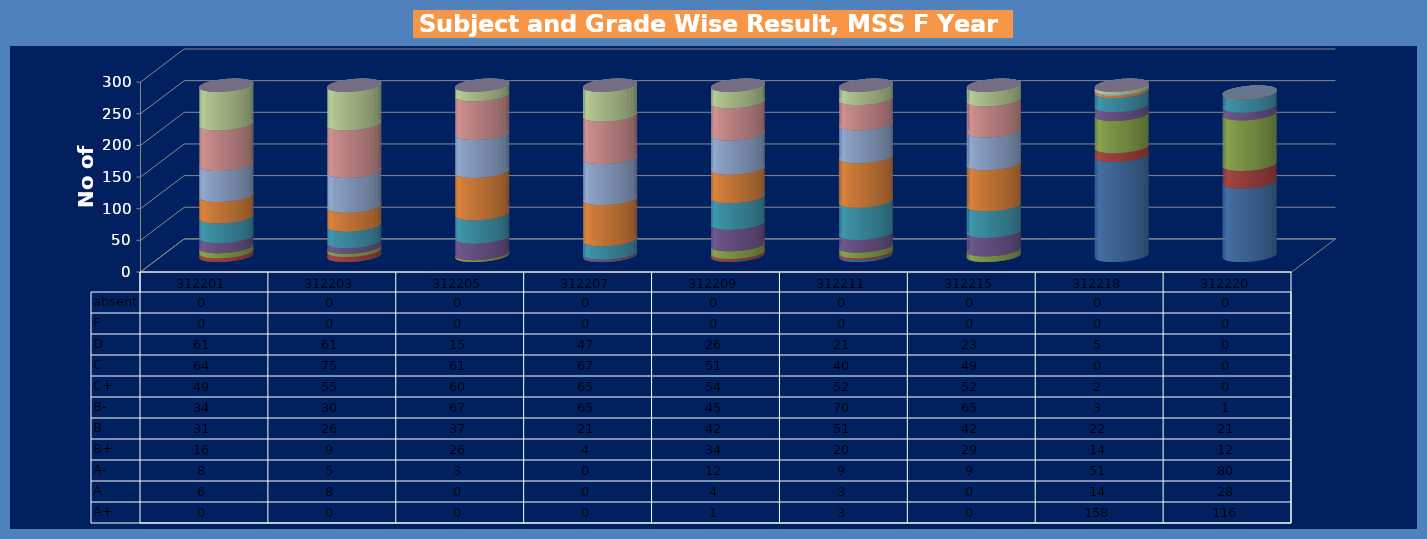
| Category | A+ | A | A- | B+ | B | B- | C+ | C | D | F | absent |
|---|---|---|---|---|---|---|---|---|---|---|---|
| 312201.0 | 0 | 6 | 8 | 16 | 31 | 34 | 49 | 64 | 61 | 0 | 0 |
| 312203.0 | 0 | 8 | 5 | 9 | 26 | 30 | 55 | 75 | 61 | 0 | 0 |
| 312205.0 | 0 | 0 | 3 | 26 | 37 | 67 | 60 | 61 | 15 | 0 | 0 |
| 312207.0 | 0 | 0 | 0 | 4 | 21 | 65 | 65 | 67 | 47 | 0 | 0 |
| 312209.0 | 1 | 4 | 12 | 34 | 42 | 45 | 54 | 51 | 26 | 0 | 0 |
| 312211.0 | 3 | 3 | 9 | 20 | 51 | 70 | 52 | 40 | 21 | 0 | 0 |
| 312215.0 | 0 | 0 | 9 | 29 | 42 | 65 | 52 | 49 | 23 | 0 | 0 |
| 312218.0 | 158 | 14 | 51 | 14 | 22 | 3 | 2 | 0 | 5 | 0 | 0 |
| 312220.0 | 116 | 28 | 80 | 12 | 21 | 1 | 0 | 0 | 0 | 0 | 0 |